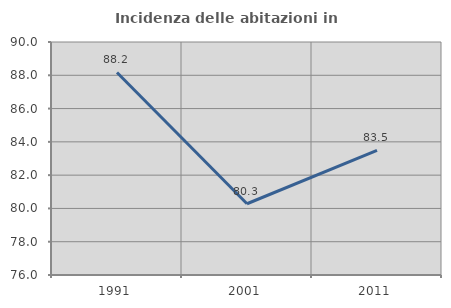
| Category | Incidenza delle abitazioni in proprietà  |
|---|---|
| 1991.0 | 88.168 |
| 2001.0 | 80.282 |
| 2011.0 | 83.485 |